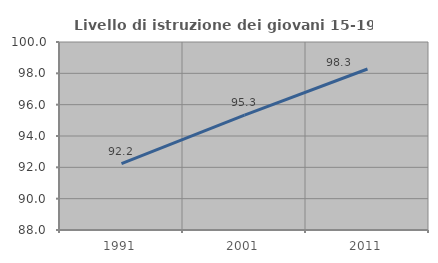
| Category | Livello di istruzione dei giovani 15-19 anni |
|---|---|
| 1991.0 | 92.241 |
| 2001.0 | 95.327 |
| 2011.0 | 98.276 |